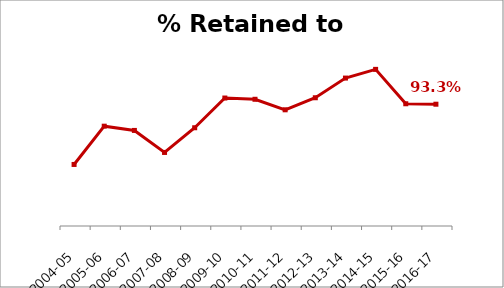
| Category | % |
|---|---|
| 2016-17 | 0.933 |
| 2015-16 | 0.933 |
| 2014-15 | 0.945 |
| 2013-14 | 0.942 |
| 2012-13 | 0.935 |
| 2011-12 | 0.931 |
| 2010-11 | 0.934 |
| 2009-10 | 0.935 |
| 2008-09 | 0.924 |
| 2007-08 | 0.916 |
| 2006-07 | 0.924 |
| 2005-06 | 0.925 |
| 2004-05 | 0.912 |